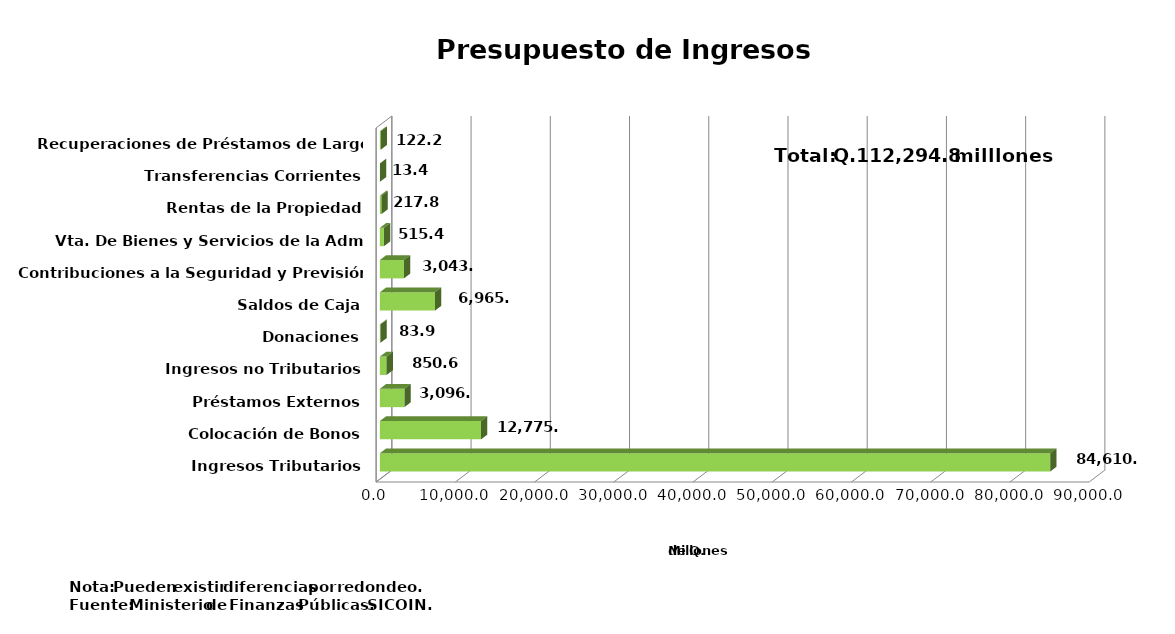
| Category | Series 0 |
|---|---|
| Ingresos Tributarios | 84610.7 |
| Colocación de Bonos | 12775.1 |
| Préstamos Externos | 3096.7 |
| Ingresos no Tributarios | 850.6 |
| Donaciones | 83.9 |
| Saldos de Caja | 6965.9 |
| Contribuciones a la Seguridad y Previsión Social  | 3043.1 |
| Vta. De Bienes y Servicios de la Adm. Pública | 515.4 |
| Rentas de la Propiedad | 217.8 |
| Transferencias Corrientes | 13.4 |
| Recuperaciones de Préstamos de Largo Plazo | 122.2 |